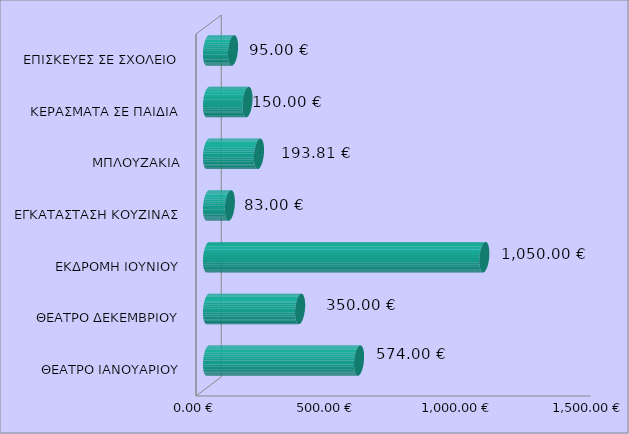
| Category | Series 0 |
|---|---|
| ΘΕΑΤΡΟ ΙΑΝΟΥΑΡΙΟΥ | 574 |
| ΘΕΑΤΡΟ ΔΕΚΕΜΒΡΙΟΥ | 350 |
| ΕΚΔΡΟΜΗ ΙΟΥΝΙΟΥ | 1050 |
| ΕΓΚΑΤΑΣΤΑΣΗ ΚΟΥΖΙΝΑΣ | 83 |
| ΜΠΛΟΥΖΑΚΙΑ | 193.81 |
| ΚΕΡΑΣΜΑΤΑ ΣΕ ΠΑΙΔΙΑ | 150 |
| ΕΠΙΣΚΕΥΕΣ ΣΕ ΣΧΟΛΕΙΟ | 95 |